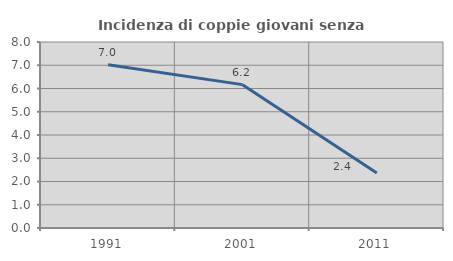
| Category | Incidenza di coppie giovani senza figli |
|---|---|
| 1991.0 | 7.018 |
| 2001.0 | 6.166 |
| 2011.0 | 2.362 |